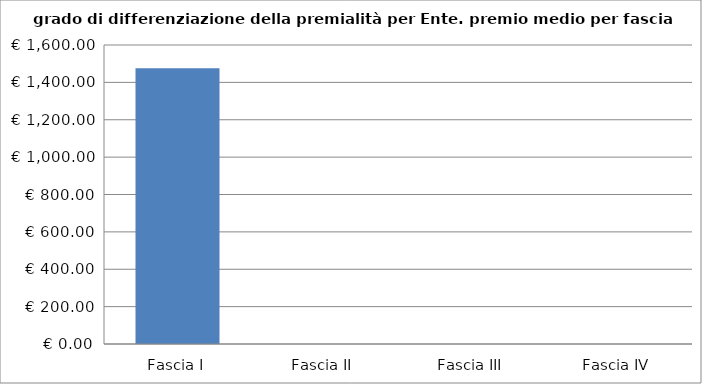
| Category | Totale ente |
|---|---|
| Fascia I | 1475.351 |
| Fascia II | 0 |
| Fascia III | 0 |
| Fascia IV | 0 |